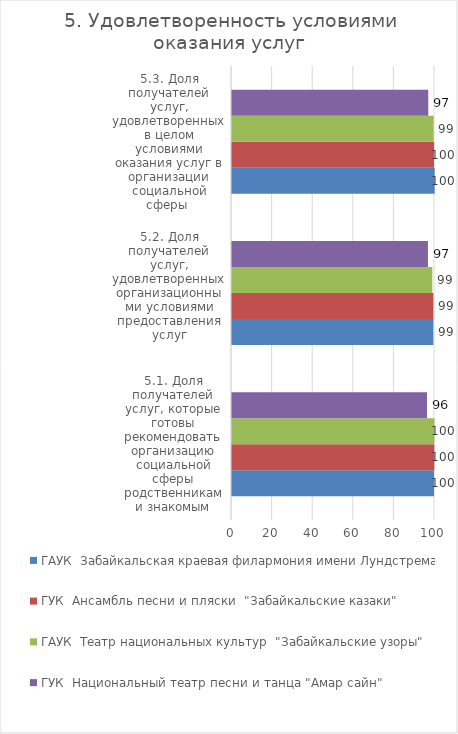
| Category | ГАУК  Забайкальская краевая филармония имени Лундстрема  | ГУК  Ансамбль песни и пляски  "Забайкальские казаки" | ГАУК  Театр национальных культур  "Забайкальские узоры" | ГУК  Национальный театр песни и танца "Амар сайн" |
|---|---|---|---|---|
| 5.1. Доля получателей услуг, которые готовы рекомендовать организацию социальной сферы родственникам и знакомым | 99.515 | 99.682 | 99.734 | 96.051 |
| 5.2. Доля получателей услуг, удовлетворенных организационными условиями предоставления услуг | 99.191 | 99.205 | 98.672 | 96.524 |
| 5.3. Доля получателей услуг, удовлетворенных в целом условиями оказания услуг в организации социальной сферы  | 99.838 | 99.523 | 99.336 | 96.682 |